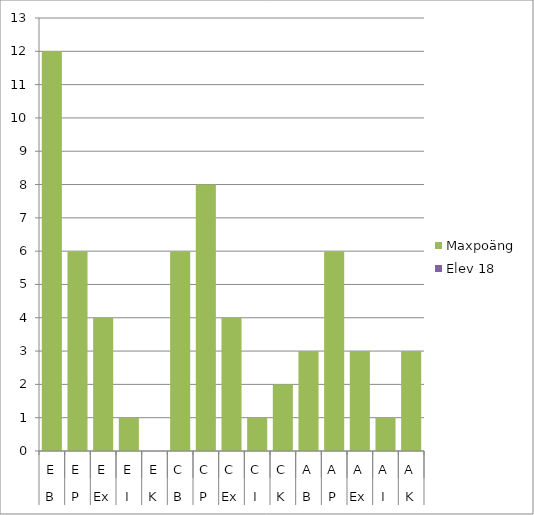
| Category | Maxpoäng | Elev 18 |
|---|---|---|
| 0 | 12 | 0 |
| 1 | 6 | 0 |
| 2 | 4 | 0 |
| 3 | 1 | 0 |
| 4 | 0 | 0 |
| 5 | 6 | 0 |
| 6 | 8 | 0 |
| 7 | 4 | 0 |
| 8 | 1 | 0 |
| 9 | 2 | 0 |
| 10 | 3 | 0 |
| 11 | 6 | 0 |
| 12 | 3 | 0 |
| 13 | 1 | 0 |
| 14 | 3 | 0 |